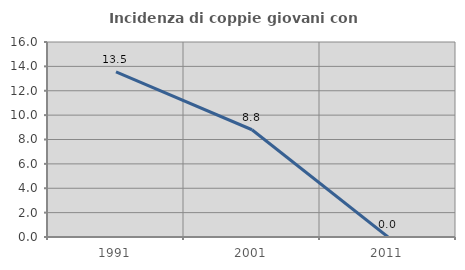
| Category | Incidenza di coppie giovani con figli |
|---|---|
| 1991.0 | 13.548 |
| 2001.0 | 8.8 |
| 2011.0 | 0 |